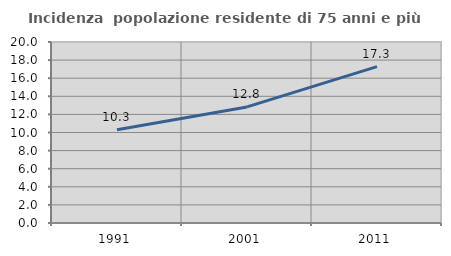
| Category | Incidenza  popolazione residente di 75 anni e più |
|---|---|
| 1991.0 | 10.3 |
| 2001.0 | 12.825 |
| 2011.0 | 17.281 |